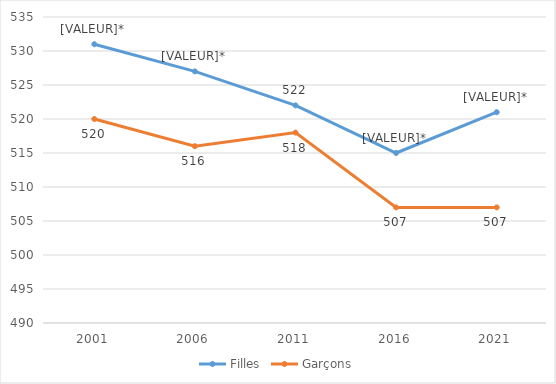
| Category | Filles | Garçons |
|---|---|---|
| 2001.0 | 531 | 520 |
| 2006.0 | 527 | 516 |
| 2011.0 | 522 | 518 |
| 2016.0 | 515 | 507 |
| 2021.0 | 521 | 507 |